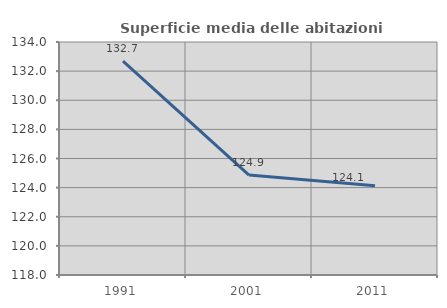
| Category | Superficie media delle abitazioni occupate |
|---|---|
| 1991.0 | 132.686 |
| 2001.0 | 124.86 |
| 2011.0 | 124.125 |